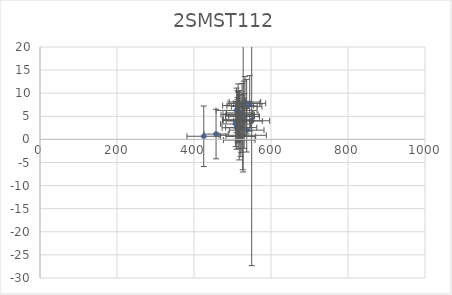
| Category | 2SMST112 |
|---|---|
| 457.29994537170495 | 1.159 |
| 526.3488993178248 | 0.887 |
| 517.5459633047096 | -0.137 |
| 544.7550023793341 | 7.791 |
| 529.5574459802883 | 7.783 |
| 513.2933629490714 | 5.339 |
| 522.5588204835313 | 2.553 |
| 510.7915355349262 | 2.527 |
| 527.6932861851741 | 30.761 |
| 514.825073074176 | 4.256 |
| 514.6052941288991 | 7.33 |
| 513.393985470196 | 4.162 |
| 518.6522655675254 | 5.051 |
| 519.5332819785455 | 5.07 |
| 518.248379620776 | 5.745 |
| 521.5319192594379 | 0.634 |
| 510.5174099809493 | 6.278 |
| 530.4317559970481 | 3.986 |
| 532.3607882761817 | 8.09 |
| 536.8041496285293 | 7.101 |
| 524.8611853342912 | 5.406 |
| 536.8910495783186 | 1.996 |
| 524.8000723459083 | 7.263 |
| 530.0918949038856 | 4.923 |
| 549.8648050308954 | 4.036 |
| 508.09422759304147 | 3.338 |
| 513.3024800701145 | 4.064 |
| 515.3841026400158 | 5.456 |
| 425.3477528280768 | 0.68 |